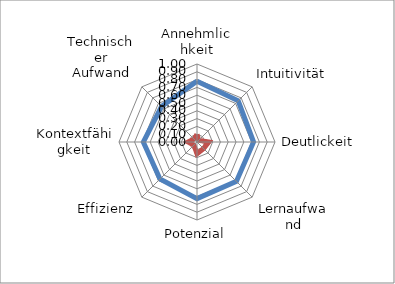
| Category | Series 0 | Series 1 |
|---|---|---|
| Annehmlichkeit | 0.78 | 0.098 |
| Intuitivität | 0.747 | 0.031 |
| Deutlickeit | 0.725 | 0.151 |
| Lernaufwand | 0.714 | 0.119 |
| Potenzial | 0.726 | 0.151 |
| Effizienz | 0.671 | 0.056 |
| Kontextfähigkeit | 0.688 | 0.115 |
| Technischer Aufwand | 0.643 | 0.054 |